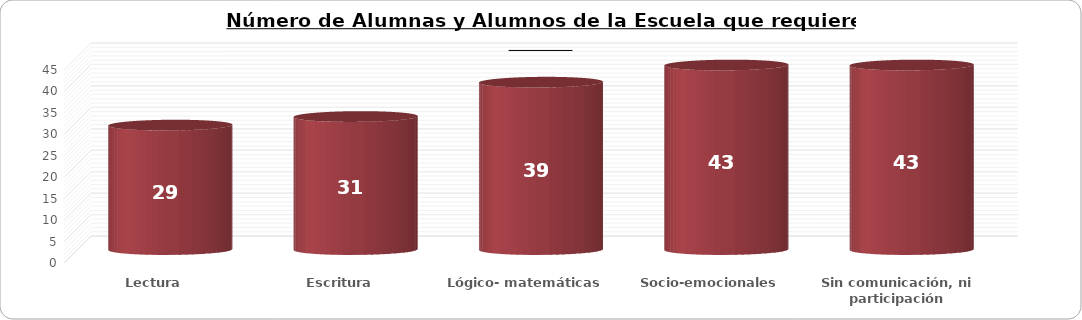
| Category | Series 0 |
|---|---|
| Lectura | 29 |
| Escritura | 31 |
| Lógico- matemáticas | 39 |
| Socio-emocionales | 43 |
| Sin comunicación, ni participación | 43 |